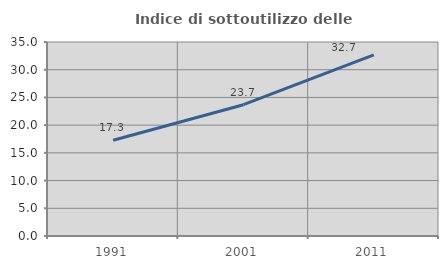
| Category | Indice di sottoutilizzo delle abitazioni  |
|---|---|
| 1991.0 | 17.279 |
| 2001.0 | 23.691 |
| 2011.0 | 32.689 |